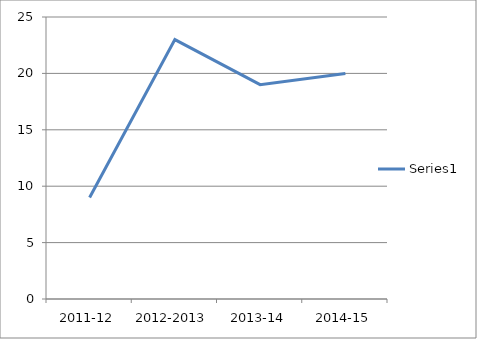
| Category | Series 0 |
|---|---|
| 2011-12 | 9 |
| 2012-2013 | 23 |
| 2013-14 | 19 |
| 2014-15 | 20 |